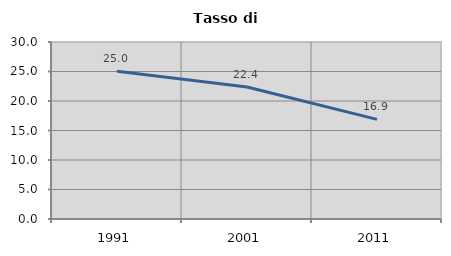
| Category | Tasso di disoccupazione   |
|---|---|
| 1991.0 | 25.045 |
| 2001.0 | 22.371 |
| 2011.0 | 16.892 |